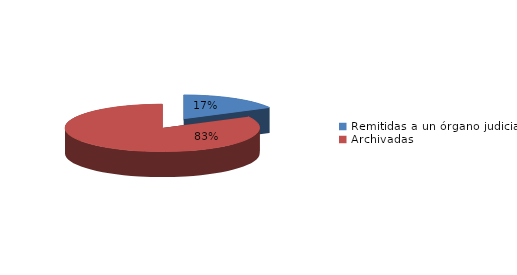
| Category | Series 0 |
|---|---|
| Remitidas a un órgano judicial | 6 |
| Archivadas | 29 |